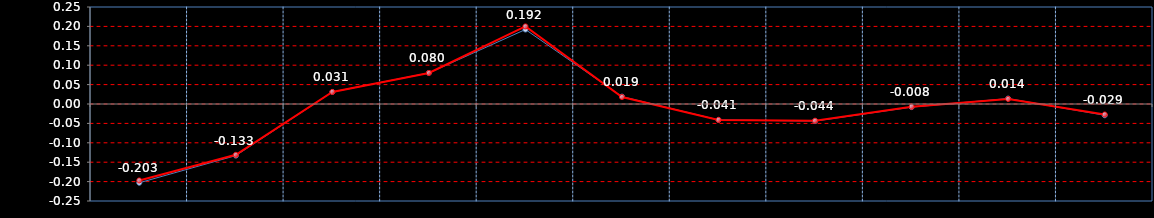
| Category | Last | Settlement |
|---|---|---|
| NOV, DEC | -0.203 | -0.197 |
| DEC, JAN | -0.133 | -0.131 |
| JAN, FEB | 0.031 | 0.031 |
| FEB, MAR | 0.08 | 0.08 |
| MAR, APR | 0.192 | 0.2 |
| APR, MAY | 0.019 | 0.018 |
| MAY, JUN | -0.041 | -0.041 |
| JUN, JUL | -0.044 | -0.043 |
| JUL, AUG | -0.008 | -0.007 |
| AUG, SEP | 0.014 | 0.013 |
| SEP, OCT | -0.029 | -0.027 |